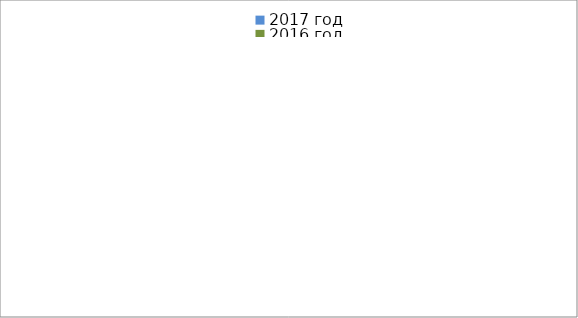
| Category | 2017 год | 2016 год |
|---|---|---|
|  - поджог | 19 | 42 |
|  - неосторожное обращение с огнём | 7 | 22 |
|  - НПТЭ электрооборудования | 27 | 22 |
|  - НПУ и Э печей | 47 | 33 |
|  - НПУ и Э транспортных средств | 45 | 33 |
|   -Шалость с огнем детей | 4 | 6 |
|  -НППБ при эксплуатации эл.приборов | 24 | 17 |
|  - курение | 37 | 31 |
| - прочие | 73 | 96 |
| - не установленные причины | 0 | 12 |